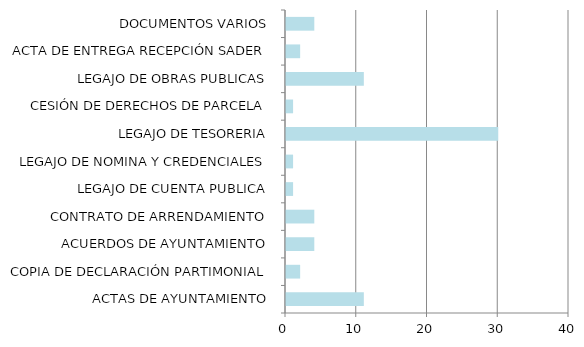
| Category | Series 0 |
|---|---|
| ACTAS DE AYUNTAMIENTO | 11 |
| COPIA DE DECLARACIÓN PARTIMONIAL | 2 |
| ACUERDOS DE AYUNTAMIENTO | 4 |
| CONTRATO DE ARRENDAMIENTO | 4 |
| LEGAJO DE CUENTA PUBLICA | 1 |
| LEGAJO DE NOMINA Y CREDENCIALES | 1 |
| LEGAJO DE TESORERIA | 30 |
| CESIÓN DE DERECHOS DE PARCELA | 1 |
| LEGAJO DE OBRAS PUBLICAS | 11 |
| ACTA DE ENTREGA RECEPCIÓN SADER | 2 |
| DOCUMENTOS VARIOS | 4 |